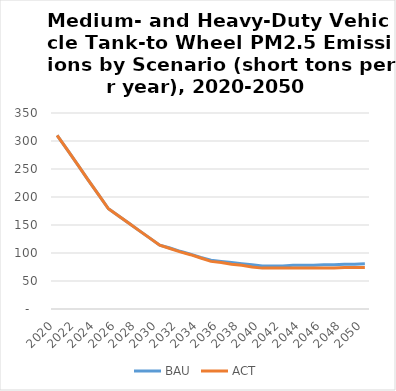
| Category | BAU | ACT |
|---|---|---|
| 2020.0 | 310 | 310 |
| 2021.0 | 284 | 284 |
| 2022.0 | 258 | 258 |
| 2023.0 | 231 | 231 |
| 2024.0 | 205 | 205 |
| 2025.0 | 179 | 179 |
| 2026.0 | 166 | 166 |
| 2027.0 | 153 | 153 |
| 2028.0 | 140 | 140 |
| 2029.0 | 127 | 127 |
| 2030.0 | 114 | 114 |
| 2031.0 | 109 | 108 |
| 2032.0 | 103 | 102 |
| 2033.0 | 98 | 97 |
| 2034.0 | 92 | 91 |
| 2035.0 | 87 | 85 |
| 2036.0 | 85 | 83 |
| 2037.0 | 83 | 80 |
| 2038.0 | 81 | 78 |
| 2039.0 | 79 | 75 |
| 2040.0 | 77 | 73 |
| 2041.0 | 77 | 73 |
| 2042.0 | 77 | 73 |
| 2043.0 | 78 | 73 |
| 2044.0 | 78 | 73 |
| 2045.0 | 78 | 73 |
| 2046.0 | 79 | 73 |
| 2047.0 | 79 | 73 |
| 2048.0 | 80 | 74 |
| 2049.0 | 80 | 74 |
| 2050.0 | 81 | 74 |